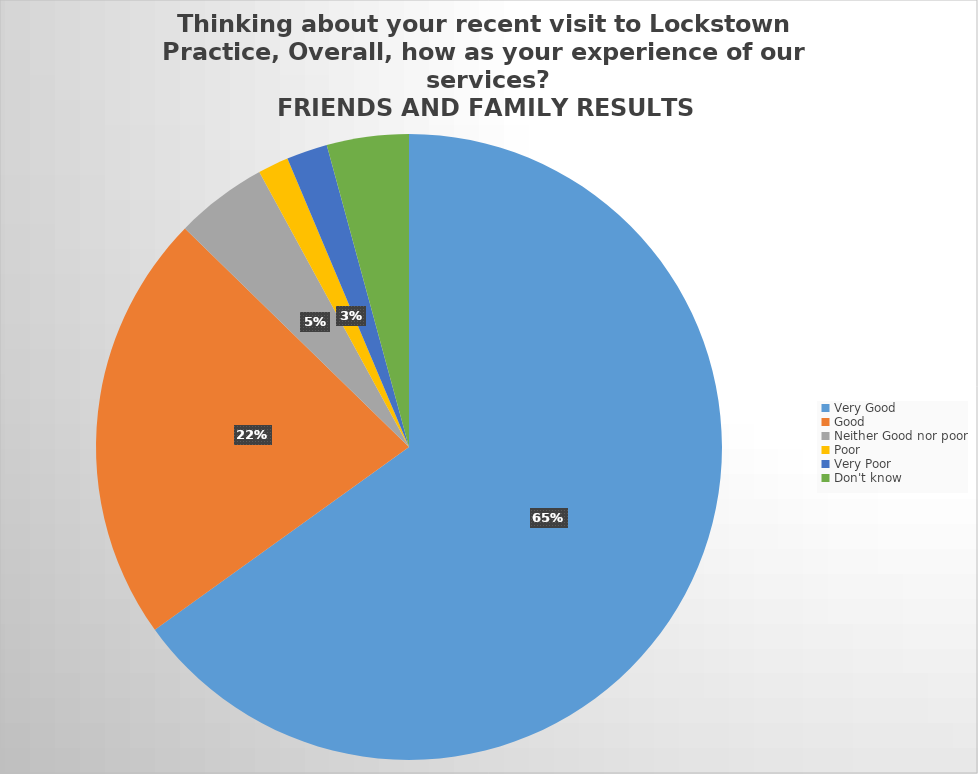
| Category | Responses |
|---|---|
| Very Good | 123 |
| Good | 42 |
| Neither Good nor poor | 9 |
| Poor | 3 |
| Very Poor | 4 |
| Don't know  | 8 |